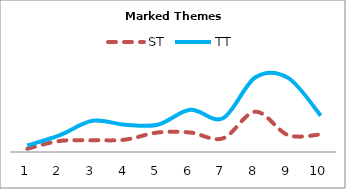
| Category | ST | TT |
|---|---|---|
| 0 | 5 | 10 |
| 1 | 17 | 26 |
| 2 | 18 | 48 |
| 3 | 19 | 42 |
| 4 | 30 | 42 |
| 5 | 30 | 65 |
| 6 | 21 | 52 |
| 7 | 62 | 115 |
| 8 | 26 | 114 |
| 9 | 27 | 56 |